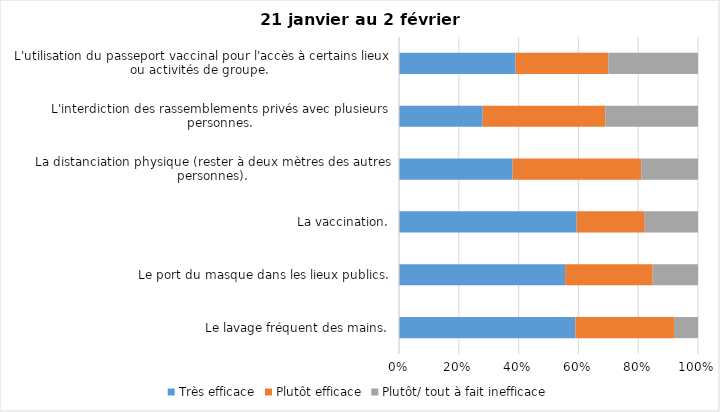
| Category | Très efficace | Plutôt efficace | Plutôt/ tout à fait inefficace |
|---|---|---|---|
| Le lavage fréquent des mains. | 59 | 33 | 8 |
| Le port du masque dans les lieux publics. | 55 | 29 | 15 |
| La vaccination. | 60 | 23 | 18 |
| La distanciation physique (rester à deux mètres des autres personnes). | 38 | 43 | 19 |
| L'interdiction des rassemblements privés avec plusieurs personnes. | 28 | 41 | 31 |
| L'utilisation du passeport vaccinal pour l'accès à certains lieux ou activités de groupe.  | 39 | 31 | 30 |